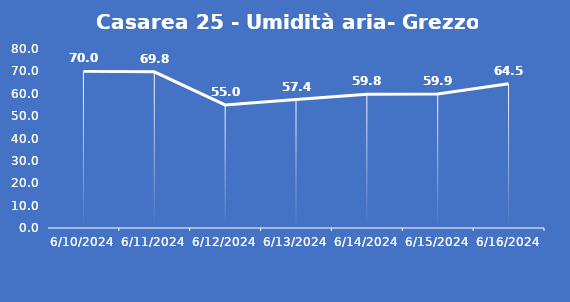
| Category | Casarea 25 - Umidità aria- Grezzo (%) |
|---|---|
| 6/10/24 | 70 |
| 6/11/24 | 69.8 |
| 6/12/24 | 55 |
| 6/13/24 | 57.4 |
| 6/14/24 | 59.8 |
| 6/15/24 | 59.9 |
| 6/16/24 | 64.5 |